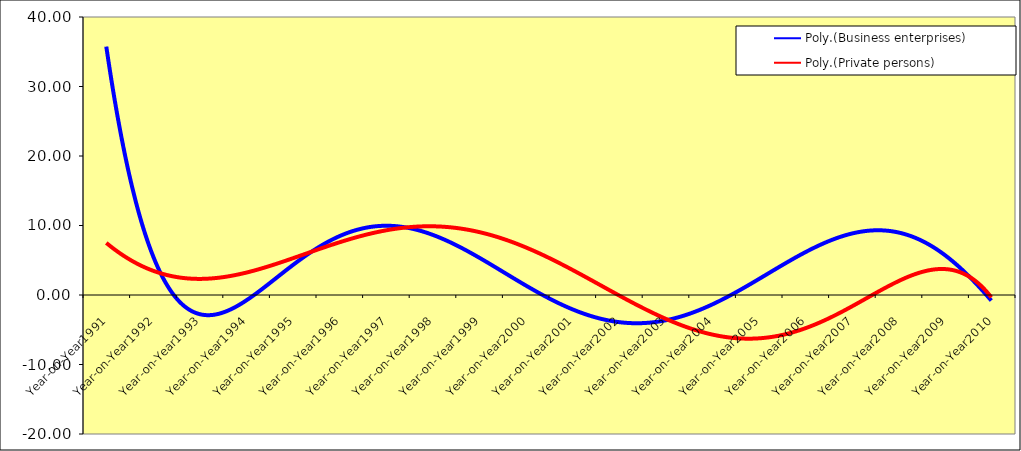
| Category | Business enterprises | Private persons |
|---|---|---|
| Year-on-Year1991 | 36.687 | 6.439 |
| Year-on-Year1992 | 1.374 | 7.267 |
| Year-on-Year1993 | 4.089 | 0.663 |
| Year-on-Year1994 | -5.695 | -2.586 |
| Year-on-Year1995 | 7.335 | 7.351 |
| Year-on-Year1996 | 1.695 | 13.614 |
| Year-on-Year1997 | 29.385 | 10.989 |
| Year-on-Year1998 | -16.196 | 4.457 |
| Year-on-Year1999 | 1.758 | 6.325 |
| Year-on-Year2000 | 27.694 | 8.502 |
| Year-on-Year2001 | -6.29 | 6.481 |
| Year-on-Year2002 | -9.964 | -4.023 |
| Year-on-Year2003 | -11.672 | 3.104 |
| Year-on-Year2004 | -2.639 | -12.178 |
| Year-on-Year2005 | 11.914 | -6.482 |
| Year-on-Year2006 | 14.342 | 5.052 |
| Year-on-Year2007 | -12.274 | -8.594 |
| Year-on-Year2008 | 25.435 | -4.04 |
| Year-on-Year2009 | -1.436 | 12.264 |
| Year-on-Year2010 | 0.598 | -3.006 |